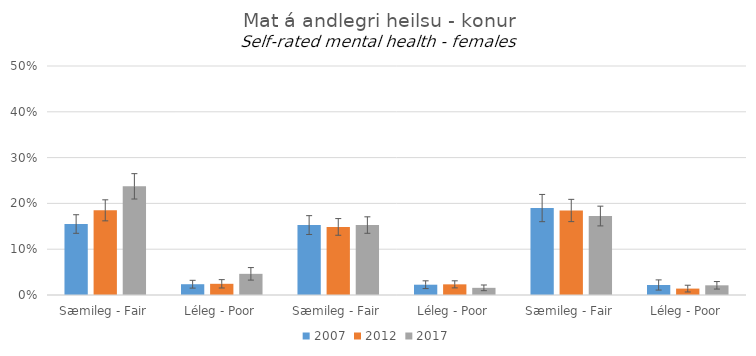
| Category | 2007 | 2012 | 2017 |
|---|---|---|---|
| 0 | 0.155 | 0.185 | 0.237 |
| 1 | 0.024 | 0.024 | 0.046 |
| 2 | 0.153 | 0.149 | 0.153 |
| 3 | 0.022 | 0.023 | 0.016 |
| 4 | 0.19 | 0.185 | 0.172 |
| 5 | 0.022 | 0.014 | 0.021 |